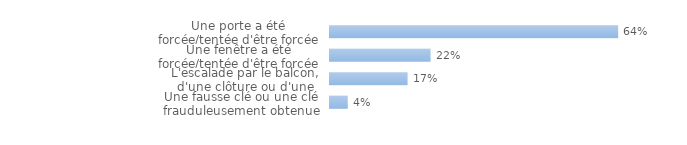
| Category | Series 0 |
|---|---|
| Une porte a été forcée/tentée d'être forcée | 0.644 |
| Une fenêtre a été forcée/tentée d'être forcée | 0.225 |
| L'escalade par le balcon, d'une clôture ou d'une grille  | 0.174 |
| Une fausse clé ou une clé frauduleusement obtenue | 0.04 |